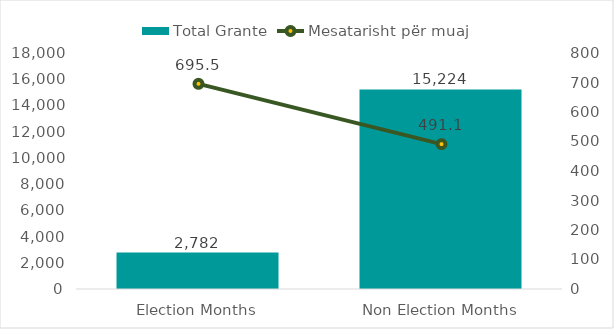
| Category | Total Grante |
|---|---|
| Election Months | 2782.004 |
| Non Election Months | 15223.963 |